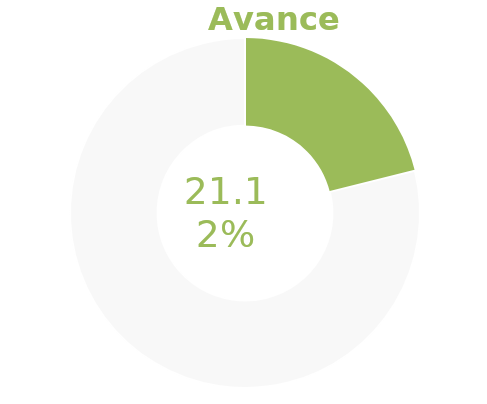
| Category | Series 0 |
|---|---|
| Acumulado 1 Trimestre | 0.211 |
| Año | -0.789 |